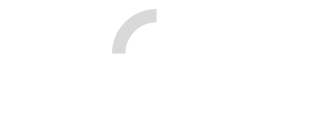
| Category | Series 0 |
|---|---|
| 0 | 0.75 |
| 1 | 0.25 |
| 2 | 0 |